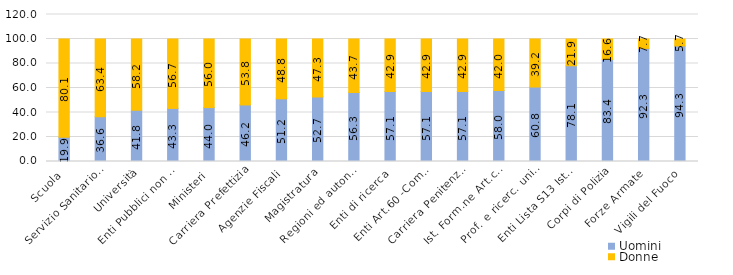
| Category | Uomini | Donne |
|---|---|---|
| Scuola | 19.868 | 80.132 |
| Servizio Sanitario Naz. | 36.578 | 63.422 |
| Università | 41.775 | 58.225 |
| Enti Pubblici non econ. | 43.341 | 56.659 |
| Ministeri | 44.01 | 55.99 |
| Carriera Prefettizia | 46.154 | 53.846 |
| Agenzie Fiscali | 51.179 | 48.821 |
| Magistratura | 52.657 | 47.343 |
| Regioni ed autonomie locali | 56.339 | 43.661 |
| Enti di ricerca | 57.143 | 42.857 |
| Enti Art.60 -Comma 3- D.165/01 | 57.143 | 42.857 |
| Carriera Penitenziaria | 57.143 | 42.857 |
| Ist. Form.ne Art.co Mus.le | 57.963 | 42.037 |
| Prof. e ricerc. universitari | 60.794 | 39.206 |
| Enti Lista S13 Istat | 78.146 | 21.854 |
| Corpi di Polizia | 83.363 | 16.637 |
| Forze Armate | 92.338 | 7.662 |
| Vigili del Fuoco | 94.313 | 5.687 |